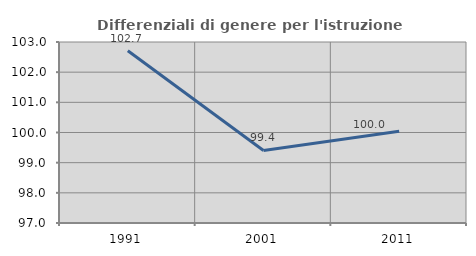
| Category | Differenziali di genere per l'istruzione superiore |
|---|---|
| 1991.0 | 102.712 |
| 2001.0 | 99.405 |
| 2011.0 | 100.044 |